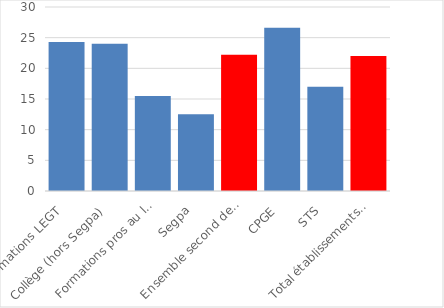
| Category | 2022 |
|---|---|
| Formations LEGT | 24.3 |
| Collège (hors Segpa) | 24 |
| Formations pros au lycée | 15.5 |
| Segpa | 12.5 |
| Ensemble second degré | 22.2 |
| CPGE | 26.6 |
| STS | 17 |
| Total établissements du second degré | 22 |